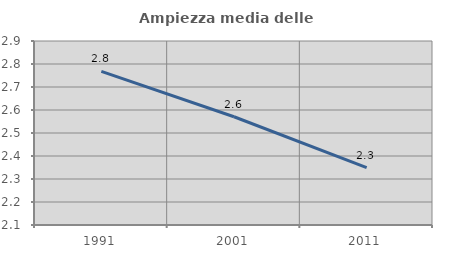
| Category | Ampiezza media delle famiglie |
|---|---|
| 1991.0 | 2.768 |
| 2001.0 | 2.571 |
| 2011.0 | 2.349 |